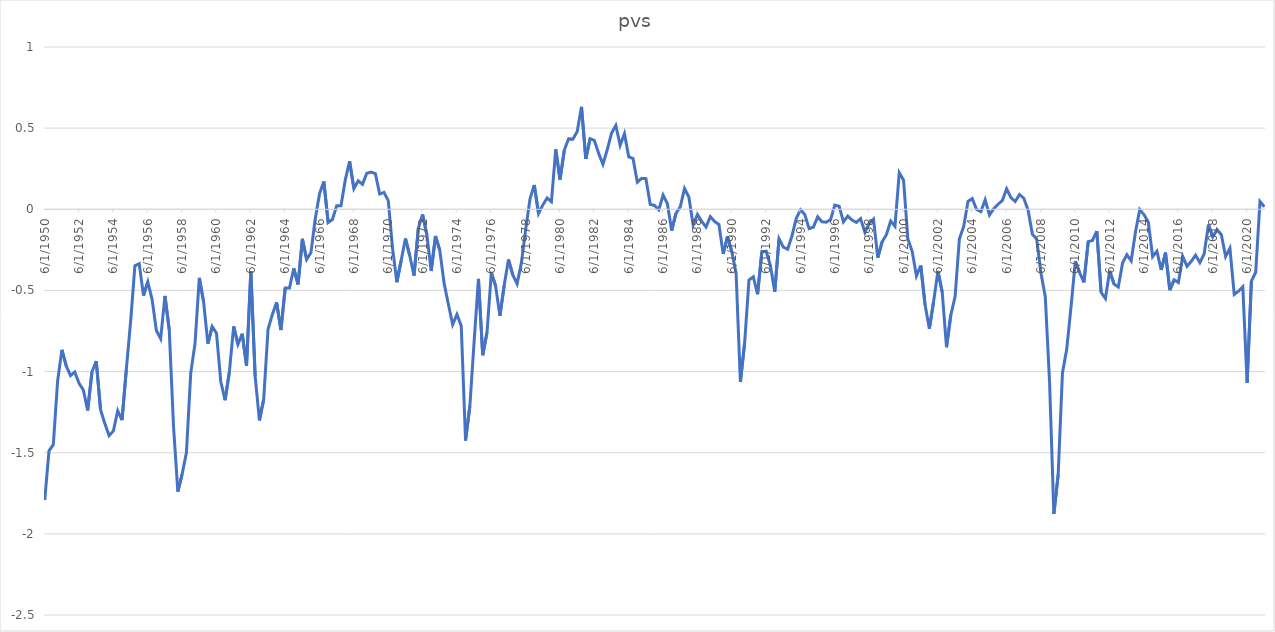
| Category | pvs |
|---|---|
| 6/30/50 | -1.792 |
| 9/30/50 | -1.489 |
| 12/31/50 | -1.45 |
| 3/31/51 | -1.059 |
| 6/30/51 | -0.866 |
| 9/30/51 | -0.965 |
| 12/31/51 | -1.025 |
| 3/31/52 | -1.003 |
| 6/30/52 | -1.073 |
| 9/30/52 | -1.113 |
| 12/31/52 | -1.24 |
| 3/31/53 | -1.003 |
| 6/30/53 | -0.935 |
| 9/30/53 | -1.234 |
| 12/31/53 | -1.321 |
| 3/31/54 | -1.395 |
| 6/30/54 | -1.366 |
| 9/30/54 | -1.241 |
| 12/31/54 | -1.3 |
| 3/31/55 | -0.987 |
| 6/30/55 | -0.692 |
| 9/30/55 | -0.348 |
| 12/31/55 | -0.335 |
| 3/31/56 | -0.532 |
| 6/30/56 | -0.447 |
| 9/30/56 | -0.555 |
| 12/31/56 | -0.747 |
| 3/31/57 | -0.798 |
| 6/30/57 | -0.534 |
| 9/30/57 | -0.743 |
| 12/31/57 | -1.341 |
| 3/31/58 | -1.74 |
| 6/30/58 | -1.632 |
| 9/30/58 | -1.499 |
| 12/31/58 | -1.011 |
| 3/31/59 | -0.828 |
| 6/30/59 | -0.423 |
| 9/30/59 | -0.571 |
| 12/31/59 | -0.828 |
| 3/31/60 | -0.722 |
| 6/30/60 | -0.764 |
| 9/30/60 | -1.061 |
| 12/31/60 | -1.176 |
| 3/31/61 | -1.002 |
| 6/30/61 | -0.722 |
| 9/30/61 | -0.832 |
| 12/31/61 | -0.767 |
| 3/31/62 | -0.964 |
| 6/30/62 | -0.38 |
| 9/30/62 | -1.028 |
| 12/31/62 | -1.301 |
| 3/31/63 | -1.17 |
| 6/30/63 | -0.739 |
| 9/30/63 | -0.65 |
| 12/31/63 | -0.574 |
| 3/31/64 | -0.744 |
| 6/30/64 | -0.485 |
| 9/30/64 | -0.485 |
| 12/31/64 | -0.364 |
| 3/31/65 | -0.463 |
| 6/30/65 | -0.182 |
| 9/30/65 | -0.31 |
| 12/31/65 | -0.267 |
| 3/31/66 | -0.059 |
| 6/30/66 | 0.096 |
| 9/30/66 | 0.171 |
| 12/31/66 | -0.082 |
| 3/31/67 | -0.063 |
| 6/30/67 | 0.022 |
| 9/30/67 | 0.023 |
| 12/31/67 | 0.183 |
| 3/31/68 | 0.296 |
| 6/30/68 | 0.127 |
| 9/30/68 | 0.176 |
| 12/31/68 | 0.154 |
| 3/31/69 | 0.222 |
| 6/30/69 | 0.23 |
| 9/30/69 | 0.22 |
| 12/31/69 | 0.094 |
| 3/31/70 | 0.105 |
| 6/30/70 | 0.054 |
| 9/30/70 | -0.239 |
| 12/31/70 | -0.449 |
| 3/31/71 | -0.317 |
| 6/30/71 | -0.18 |
| 9/30/71 | -0.285 |
| 12/31/71 | -0.408 |
| 3/31/72 | -0.116 |
| 6/30/72 | -0.032 |
| 9/30/72 | -0.159 |
| 12/31/72 | -0.38 |
| 3/31/73 | -0.165 |
| 6/30/73 | -0.253 |
| 9/30/73 | -0.455 |
| 12/31/73 | -0.586 |
| 3/31/74 | -0.71 |
| 6/30/74 | -0.647 |
| 9/30/74 | -0.72 |
| 12/31/74 | -1.425 |
| 3/31/75 | -1.212 |
| 6/30/75 | -0.813 |
| 9/30/75 | -0.429 |
| 12/31/75 | -0.899 |
| 3/31/76 | -0.758 |
| 6/30/76 | -0.391 |
| 9/30/76 | -0.473 |
| 12/31/76 | -0.657 |
| 3/31/77 | -0.468 |
| 6/30/77 | -0.31 |
| 9/30/77 | -0.404 |
| 12/31/77 | -0.459 |
| 3/31/78 | -0.331 |
| 6/30/78 | -0.125 |
| 9/30/78 | 0.062 |
| 12/31/78 | 0.15 |
| 3/31/79 | -0.026 |
| 6/30/79 | 0.027 |
| 9/30/79 | 0.069 |
| 12/31/79 | 0.047 |
| 3/31/80 | 0.369 |
| 6/30/80 | 0.184 |
| 9/30/80 | 0.365 |
| 12/31/80 | 0.435 |
| 3/31/81 | 0.432 |
| 6/30/81 | 0.479 |
| 9/30/81 | 0.631 |
| 12/31/81 | 0.31 |
| 3/31/82 | 0.435 |
| 6/30/82 | 0.424 |
| 9/30/82 | 0.344 |
| 12/31/82 | 0.278 |
| 3/31/83 | 0.367 |
| 6/30/83 | 0.47 |
| 9/30/83 | 0.517 |
| 12/31/83 | 0.394 |
| 3/31/84 | 0.466 |
| 6/30/84 | 0.323 |
| 9/30/84 | 0.313 |
| 12/31/84 | 0.167 |
| 3/31/85 | 0.19 |
| 6/30/85 | 0.189 |
| 9/30/85 | 0.03 |
| 12/31/85 | 0.024 |
| 3/31/86 | -0.003 |
| 6/30/86 | 0.088 |
| 9/30/86 | 0.034 |
| 12/31/86 | -0.131 |
| 3/31/87 | -0.025 |
| 6/30/87 | 0.015 |
| 9/30/87 | 0.129 |
| 12/31/87 | 0.075 |
| 3/31/88 | -0.097 |
| 6/30/88 | -0.032 |
| 9/30/88 | -0.075 |
| 12/31/88 | -0.109 |
| 3/31/89 | -0.045 |
| 6/30/89 | -0.075 |
| 9/30/89 | -0.094 |
| 12/31/89 | -0.275 |
| 3/31/90 | -0.168 |
| 6/30/90 | -0.261 |
| 9/30/90 | -0.394 |
| 12/31/90 | -1.064 |
| 3/31/91 | -0.82 |
| 6/30/91 | -0.435 |
| 9/30/91 | -0.416 |
| 12/31/91 | -0.524 |
| 3/31/92 | -0.262 |
| 6/30/92 | -0.258 |
| 9/30/92 | -0.348 |
| 12/31/92 | -0.509 |
| 3/31/93 | -0.182 |
| 6/30/93 | -0.233 |
| 9/30/93 | -0.247 |
| 12/31/93 | -0.166 |
| 3/31/94 | -0.057 |
| 6/30/94 | -0.003 |
| 9/30/94 | -0.033 |
| 12/31/94 | -0.119 |
| 3/31/95 | -0.11 |
| 6/30/95 | -0.046 |
| 9/30/95 | -0.077 |
| 12/31/95 | -0.08 |
| 3/31/96 | -0.063 |
| 6/30/96 | 0.026 |
| 9/30/96 | 0.018 |
| 12/31/96 | -0.077 |
| 3/31/97 | -0.042 |
| 6/30/97 | -0.066 |
| 9/30/97 | -0.081 |
| 12/31/97 | -0.058 |
| 3/31/98 | -0.142 |
| 6/30/98 | -0.086 |
| 9/30/98 | -0.061 |
| 12/31/98 | -0.298 |
| 3/31/99 | -0.201 |
| 6/30/99 | -0.157 |
| 9/30/99 | -0.072 |
| 12/31/99 | -0.104 |
| 3/31/00 | 0.226 |
| 6/30/00 | 0.179 |
| 9/30/00 | -0.183 |
| 12/31/00 | -0.259 |
| 3/31/01 | -0.41 |
| 6/30/01 | -0.346 |
| 9/30/01 | -0.587 |
| 12/31/01 | -0.737 |
| 3/31/02 | -0.567 |
| 6/30/02 | -0.38 |
| 9/30/02 | -0.511 |
| 12/31/02 | -0.85 |
| 3/31/03 | -0.652 |
| 6/30/03 | -0.537 |
| 9/30/03 | -0.183 |
| 12/31/03 | -0.105 |
| 3/31/04 | 0.048 |
| 6/30/04 | 0.066 |
| 9/30/04 | -0.001 |
| 12/31/04 | -0.014 |
| 3/31/05 | 0.058 |
| 6/30/05 | -0.035 |
| 9/30/05 | 0.004 |
| 12/31/05 | 0.031 |
| 3/31/06 | 0.054 |
| 6/30/06 | 0.127 |
| 9/30/06 | 0.072 |
| 12/31/06 | 0.048 |
| 3/31/07 | 0.091 |
| 6/30/07 | 0.068 |
| 9/30/07 | -0.006 |
| 12/31/07 | -0.154 |
| 3/31/08 | -0.184 |
| 6/30/08 | -0.394 |
| 9/30/08 | -0.539 |
| 12/31/08 | -1.065 |
| 3/31/09 | -1.877 |
| 6/30/09 | -1.636 |
| 9/30/09 | -1.009 |
| 12/31/09 | -0.861 |
| 3/31/10 | -0.6 |
| 6/30/10 | -0.32 |
| 9/30/10 | -0.39 |
| 12/31/10 | -0.45 |
| 3/31/11 | -0.199 |
| 6/30/11 | -0.192 |
| 9/30/11 | -0.135 |
| 12/31/11 | -0.511 |
| 3/31/12 | -0.55 |
| 6/30/12 | -0.379 |
| 9/30/12 | -0.46 |
| 12/31/12 | -0.479 |
| 3/31/13 | -0.33 |
| 6/30/13 | -0.28 |
| 9/30/13 | -0.318 |
| 12/31/13 | -0.14 |
| 3/31/14 | -0.002 |
| 6/30/14 | -0.034 |
| 9/30/14 | -0.08 |
| 12/31/14 | -0.292 |
| 3/31/15 | -0.259 |
| 6/30/15 | -0.374 |
| 9/30/15 | -0.267 |
| 12/31/15 | -0.498 |
| 3/31/16 | -0.435 |
| 6/30/16 | -0.451 |
| 9/30/16 | -0.29 |
| 12/31/16 | -0.351 |
| 3/31/17 | -0.321 |
| 6/30/17 | -0.283 |
| 9/30/17 | -0.328 |
| 12/31/17 | -0.275 |
| 3/31/18 | -0.094 |
| 6/30/18 | -0.17 |
| 9/30/18 | -0.126 |
| 12/31/18 | -0.157 |
| 3/31/19 | -0.291 |
| 6/30/19 | -0.24 |
| 9/30/19 | -0.525 |
| 12/31/19 | -0.505 |
| 3/31/20 | -0.477 |
| 6/30/20 | -1.069 |
| 9/30/20 | -0.443 |
| 12/31/20 | -0.388 |
| 3/31/21 | 0.048 |
| 6/30/21 | 0.015 |